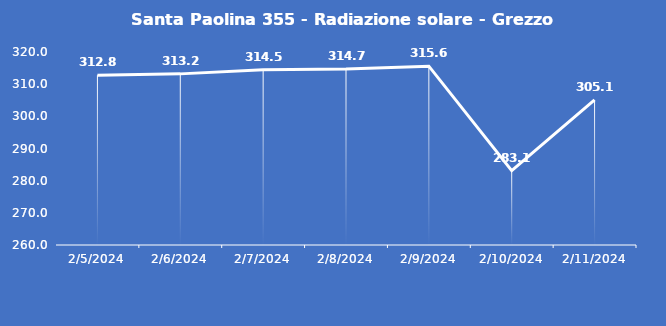
| Category | Santa Paolina 355 - Radiazione solare - Grezzo (W/m2) |
|---|---|
| 2/5/24 | 312.8 |
| 2/6/24 | 313.2 |
| 2/7/24 | 314.5 |
| 2/8/24 | 314.7 |
| 2/9/24 | 315.6 |
| 2/10/24 | 283.1 |
| 2/11/24 | 305.1 |